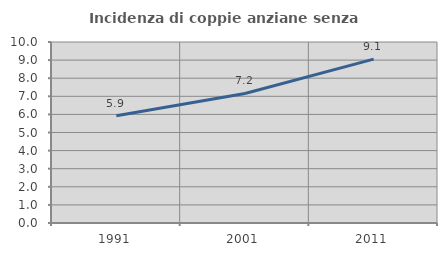
| Category | Incidenza di coppie anziane senza figli  |
|---|---|
| 1991.0 | 5.923 |
| 2001.0 | 7.158 |
| 2011.0 | 9.053 |